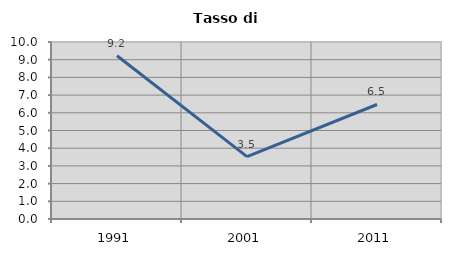
| Category | Tasso di disoccupazione   |
|---|---|
| 1991.0 | 9.226 |
| 2001.0 | 3.526 |
| 2011.0 | 6.47 |